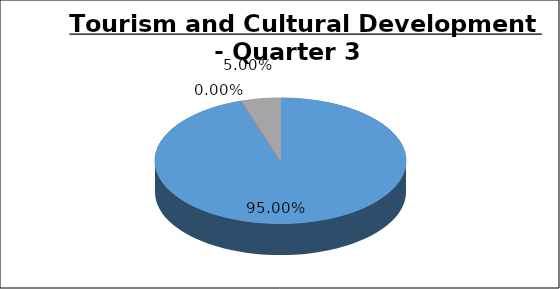
| Category | Q3 |
|---|---|
| Green | 0.95 |
| Amber | 0 |
| Red | 0.05 |